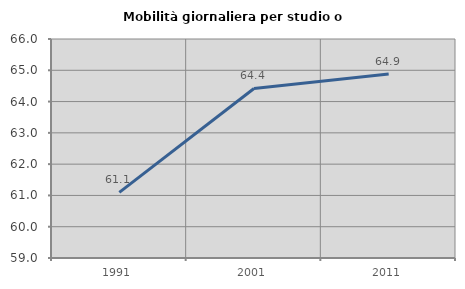
| Category | Mobilità giornaliera per studio o lavoro |
|---|---|
| 1991.0 | 61.098 |
| 2001.0 | 64.42 |
| 2011.0 | 64.884 |